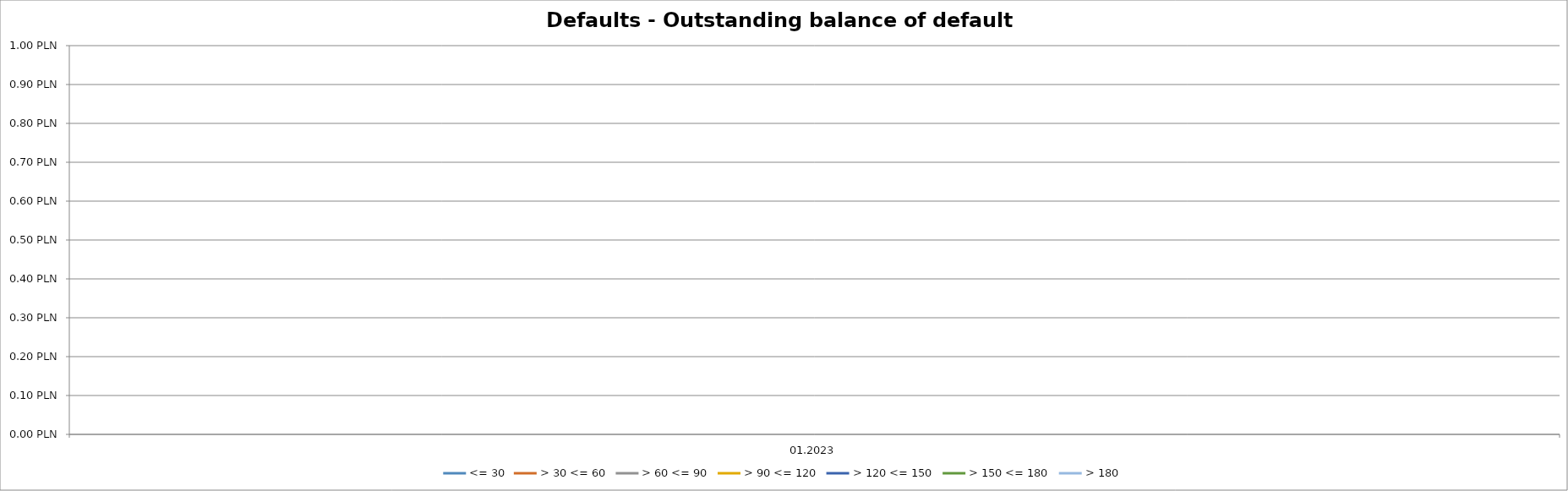
| Category | <= 30 | > 30 <= 60 | > 60 <= 90 | > 90 <= 120 | > 120 <= 150 | > 150 <= 180 | > 180 |
|---|---|---|---|---|---|---|---|
| 01.2023 | 0 | 0 | 0 | 0 | 0 | 0 | 0 |